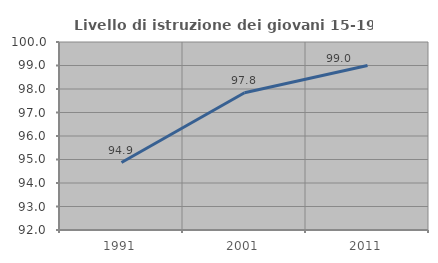
| Category | Livello di istruzione dei giovani 15-19 anni |
|---|---|
| 1991.0 | 94.872 |
| 2001.0 | 97.843 |
| 2011.0 | 99.001 |